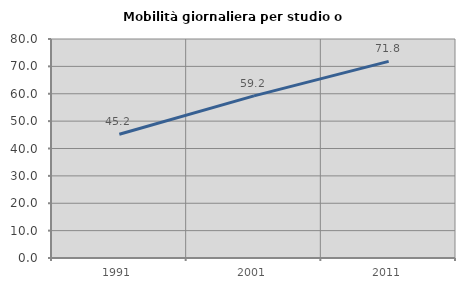
| Category | Mobilità giornaliera per studio o lavoro |
|---|---|
| 1991.0 | 45.209 |
| 2001.0 | 59.223 |
| 2011.0 | 71.84 |